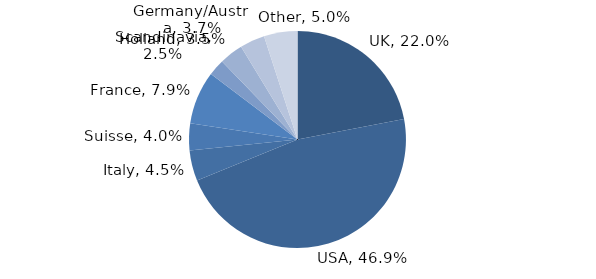
| Category | Investment Style |
|---|---|
| UK | 0.22 |
| USA | 0.469 |
| Italy | 0.045 |
| Suisse | 0.04 |
| France | 0.079 |
| Scandinavia | 0.025 |
| Holland | 0.035 |
| Germany/Austria | 0.037 |
| Other | 0.05 |